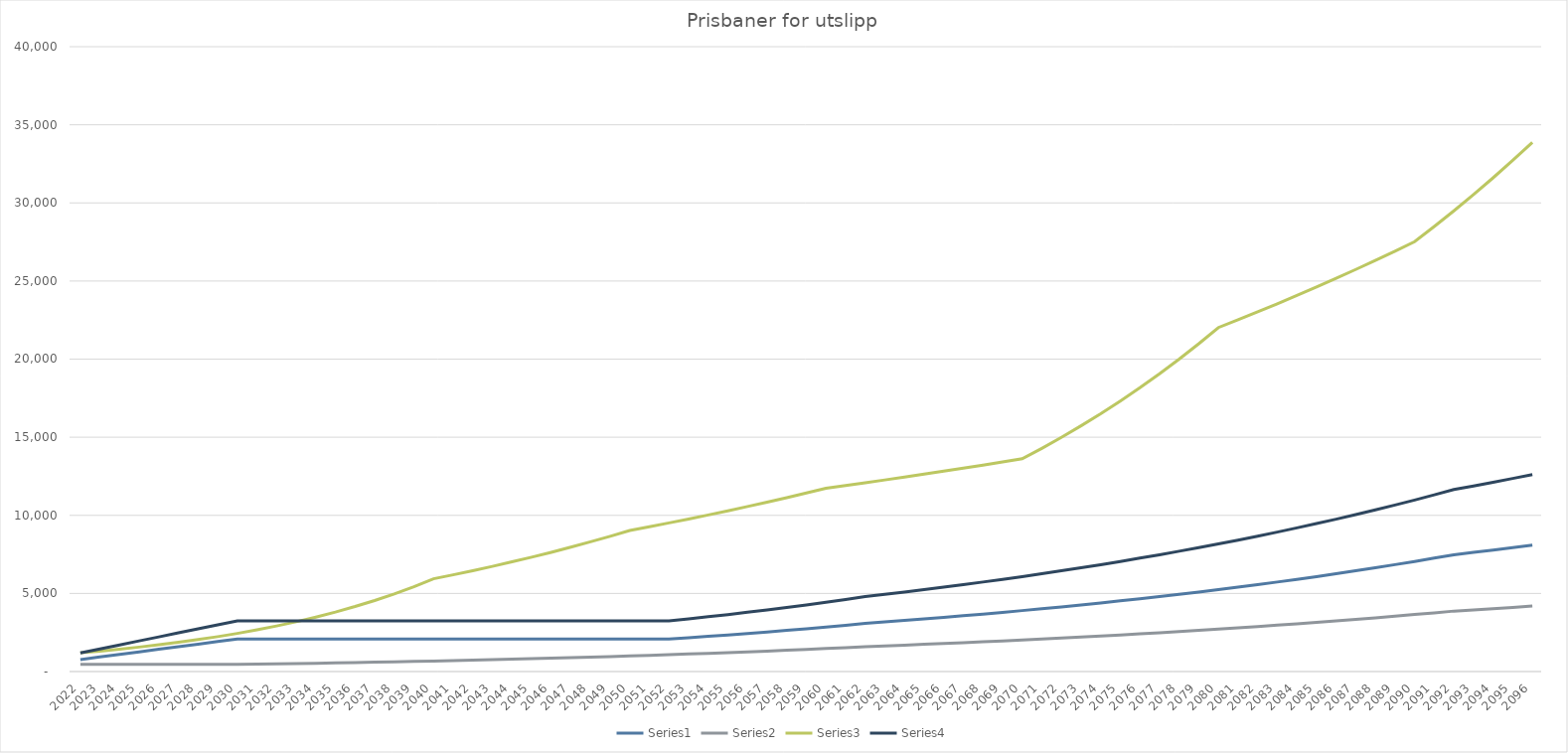
| Category | Series 6 | Series 7 | Series 8 | Series 9 | Series 0 | Series 1 | Series 2 | Series 3 | Series 4 | Series 5 |
|---|---|---|---|---|---|---|---|---|---|---|
| 2022.0 | 766 | 461 | 1200 | 1193.204 |  |  |  |  |  |  |
| 2023.0 | 931 | 457 | 1311 | 1450.225 |  |  |  |  |  |  |
| 2024.0 | 1095 | 455 | 1433 | 1705.689 |  |  |  |  |  |  |
| 2025.0 | 1260 | 454 | 1566 | 1962.711 |  |  |  |  |  |  |
| 2026.0 | 1424 | 455 | 1711 | 2218.175 |  |  |  |  |  |  |
| 2027.0 | 1589 | 455 | 1870 | 2475.196 |  |  |  |  |  |  |
| 2028.0 | 1754 | 455 | 2044 | 2732.218 |  |  |  |  |  |  |
| 2029.0 | 1918 | 455 | 2233 | 2987.682 |  |  |  |  |  |  |
| 2030.0 | 2083 | 455 | 2441 | 3244.704 |  |  |  |  |  |  |
| 2031.0 | 2083 | 473 | 2668 | 3244.704 |  |  |  |  |  |  |
| 2032.0 | 2083 | 492 | 2916 | 3244.704 |  |  |  |  |  |  |
| 2033.0 | 2083 | 511 | 3187 | 3244.704 |  |  |  |  |  |  |
| 2034.0 | 2083 | 532 | 3484 | 3244.704 |  |  |  |  |  |  |
| 2035.0 | 2083 | 553 | 3808 | 3244.704 |  |  |  |  |  |  |
| 2036.0 | 2083 | 575 | 4162 | 3244.704 |  |  |  |  |  |  |
| 2037.0 | 2083 | 598 | 4549 | 3244.704 |  |  |  |  |  |  |
| 2038.0 | 2083 | 622 | 4972 | 3244.704 |  |  |  |  |  |  |
| 2039.0 | 2083 | 647 | 5435 | 3244.704 |  |  |  |  |  |  |
| 2040.0 | 2083 | 673 | 5940 | 3244.704 |  |  |  |  |  |  |
| 2041.0 | 2083 | 700 | 6194 | 3244.704 |  |  |  |  |  |  |
| 2042.0 | 2083 | 728 | 6459 | 3244.704 |  |  |  |  |  |  |
| 2043.0 | 2083 | 757 | 6735 | 3244.704 |  |  |  |  |  |  |
| 2044.0 | 2083 | 787 | 7023 | 3244.704 |  |  |  |  |  |  |
| 2045.0 | 2083 | 819 | 7323 | 3244.704 |  |  |  |  |  |  |
| 2046.0 | 2083 | 852 | 7636 | 3244.704 |  |  |  |  |  |  |
| 2047.0 | 2083 | 886 | 7963 | 3244.704 |  |  |  |  |  |  |
| 2048.0 | 2083 | 921 | 8304 | 3244.704 |  |  |  |  |  |  |
| 2049.0 | 2083 | 958 | 8659 | 3244.704 |  |  |  |  |  |  |
| 2050.0 | 2083 | 996 | 9029 | 3244.704 |  |  |  |  |  |  |
| 2051.0 | 2083 | 1036 | 9268 | 3244.704 |  |  |  |  |  |  |
| 2052.0 | 2083 | 1077 | 9514 | 3244.704 |  |  |  |  |  |  |
| 2053.0 | 2165 | 1121 | 9766 | 3372.436 |  |  |  |  |  |  |
| 2054.0 | 2251 | 1165 | 10025 | 3506.398 |  |  |  |  |  |  |
| 2055.0 | 2341 | 1212 | 10291 | 3646.592 |  |  |  |  |  |  |
| 2056.0 | 2435 | 1260 | 10563 | 3793.017 |  |  |  |  |  |  |
| 2057.0 | 2532 | 1311 | 10843 | 3944.114 |  |  |  |  |  |  |
| 2058.0 | 2634 | 1363 | 11131 | 4103 |  |  |  |  |  |  |
| 2059.0 | 2739 | 1418 | 11426 | 4266.559 |  |  |  |  |  |  |
| 2060.0 | 2848 | 1475 | 11729 | 4436.35 |  |  |  |  |  |  |
| 2061.0 | 2962 | 1534 | 11905 | 4613.928 |  |  |  |  |  |  |
| 2062.0 | 3081 | 1595 | 12085 | 4799.295 |  |  |  |  |  |  |
| 2063.0 | 3173 | 1643 | 12266 | 4942.604 |  |  |  |  |  |  |
| 2064.0 | 3269 | 1692 | 12451 | 5092.144 |  |  |  |  |  |  |
| 2065.0 | 3367 | 1743 | 12639 | 5244.799 |  |  |  |  |  |  |
| 2066.0 | 3468 | 1795 | 12829 | 5402.128 |  |  |  |  |  |  |
| 2067.0 | 3572 | 1849 | 13022 | 5564.129 |  |  |  |  |  |  |
| 2068.0 | 3679 | 1904 | 13218 | 5730.804 |  |  |  |  |  |  |
| 2069.0 | 3789 | 1962 | 13417 | 5902.152 |  |  |  |  |  |  |
| 2070.0 | 3903 | 2020 | 13619 | 6079.73 |  |  |  |  |  |  |
| 2071.0 | 4020 | 2081 | 14289 | 6261.982 |  |  |  |  |  |  |
| 2072.0 | 4140 | 2143 | 14993 | 6448.907 |  |  |  |  |  |  |
| 2073.0 | 4265 | 2208 | 15731 | 6643.62 |  |  |  |  |  |  |
| 2074.0 | 4393 | 2274 | 16505 | 6843.007 |  |  |  |  |  |  |
| 2075.0 | 4524 | 2342 | 17318 | 7047.067 |  |  |  |  |  |  |
| 2076.0 | 4660 | 2412 | 18170 | 7258.915 |  |  |  |  |  |  |
| 2077.0 | 4800 | 2485 | 19065 | 7476.994 |  |  |  |  |  |  |
| 2078.0 | 4944 | 2559 | 20003 | 7701.303 |  |  |  |  |  |  |
| 2079.0 | 5092 | 2636 | 20988 | 7931.844 |  |  |  |  |  |  |
| 2080.0 | 5245 | 2715 | 22021 | 8170.173 |  |  |  |  |  |  |
| 2081.0 | 5402 | 2797 | 22517 | 8414.733 |  |  |  |  |  |  |
| 2082.0 | 5564 | 2881 | 23025 | 8667.082 |  |  |  |  |  |  |
| 2083.0 | 5731 | 2967 | 23544 | 8927.219 |  |  |  |  |  |  |
| 2084.0 | 5903 | 3056 | 24074 | 9195.144 |  |  |  |  |  |  |
| 2085.0 | 6080 | 3148 | 24617 | 9470.859 |  |  |  |  |  |  |
| 2086.0 | 6263 | 3242 | 25172 | 9755.919 |  |  |  |  |  |  |
| 2087.0 | 6451 | 3339 | 25739 | 10048.768 |  |  |  |  |  |  |
| 2088.0 | 6644 | 3440 | 26319 | 10349.405 |  |  |  |  |  |  |
| 2089.0 | 6844 | 3543 | 26912 | 10660.947 |  |  |  |  |  |  |
| 2090.0 | 7049 | 3649 | 27518 | 10980.277 |  |  |  |  |  |  |
| 2091.0 | 7260 | 3759 | 28488 | 11308.953 |  |  |  |  |  |  |
| 2092.0 | 7478 | 3871 | 29491 | 11648.533 |  |  |  |  |  |  |
| 2093.0 | 7628 | 3949 | 30530 | 11882.189 |  |  |  |  |  |  |
| 2094.0 | 7780 | 4028 | 31605 | 12118.961 |  |  |  |  |  |  |
| 2095.0 | 7936 | 4108 | 32719 | 12361.963 |  |  |  |  |  |  |
| 2096.0 | 8095 | 4190 | 33871 | 12609.638 |  |  |  |  |  |  |